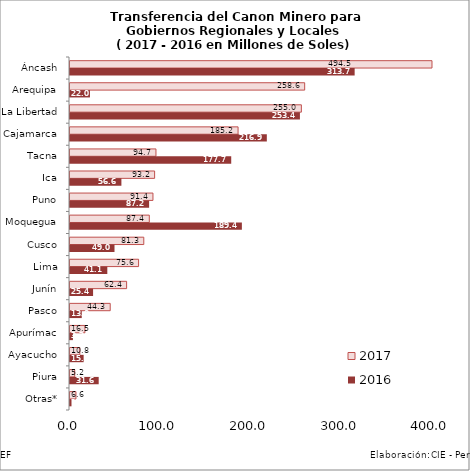
| Category | 2017 | 2016 |
|---|---|---|
| Áncash | 494.475 | 313.664 |
| Arequipa | 258.609 | 21.985 |
| La Libertad | 254.956 | 253.361 |
| Cajamarca | 185.196 | 216.89 |
| Tacna | 94.716 | 177.66 |
| Ica | 93.246 | 56.639 |
| Puno | 91.418 | 87.175 |
| Moquegua | 87.391 | 189.395 |
| Cusco | 81.305 | 49.043 |
| Lima | 75.575 | 41.112 |
| Junín | 62.386 | 25.434 |
| Pasco | 44.308 | 12.96 |
| Apurímac | 16.469 | 3.207 |
| Ayacucho | 10.814 | 15.023 |
| Piura | 5.205 | 31.623 |
| Otras* | 6.552 | 1.645 |